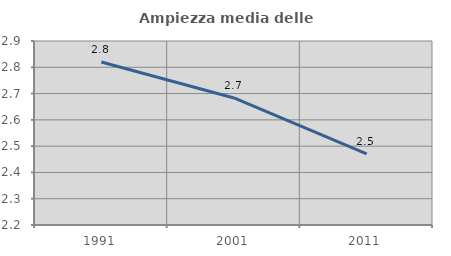
| Category | Ampiezza media delle famiglie |
|---|---|
| 1991.0 | 2.82 |
| 2001.0 | 2.683 |
| 2011.0 | 2.471 |